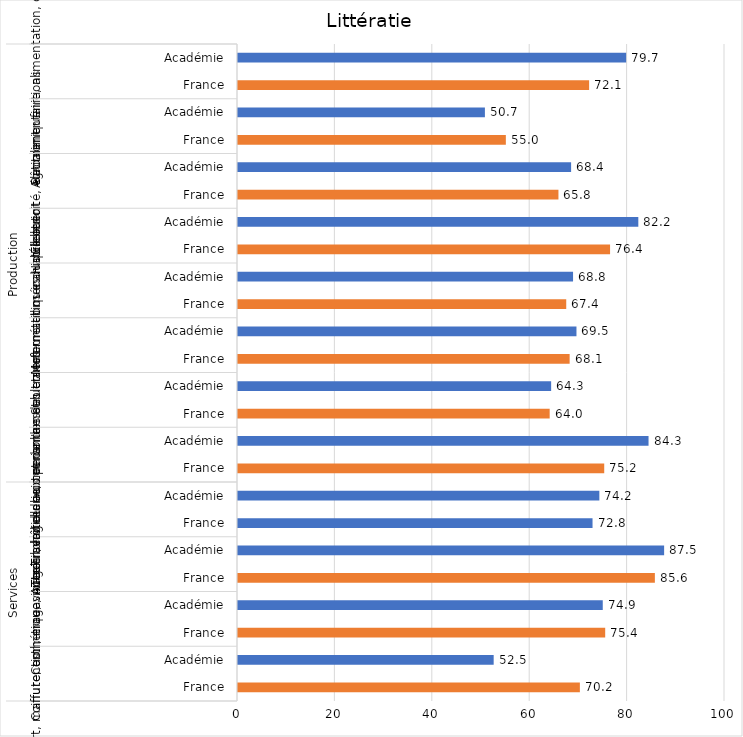
| Category | Series 0 |
|---|---|
| 0 | 70.2 |
| 1 | 52.5 |
| 2 | 75.4 |
| 3 | 74.9 |
| 4 | 85.6 |
| 5 | 87.5 |
| 6 | 72.8 |
| 7 | 74.2 |
| 8 | 75.2 |
| 9 | 84.3 |
| 10 | 64 |
| 11 | 64.3 |
| 12 | 68.1 |
| 13 | 69.5 |
| 14 | 67.4 |
| 15 | 68.8 |
| 16 | 76.4 |
| 17 | 82.2 |
| 18 | 65.8 |
| 19 | 68.4 |
| 20 | 55 |
| 21 | 50.7 |
| 22 | 72.1 |
| 23 | 79.7 |